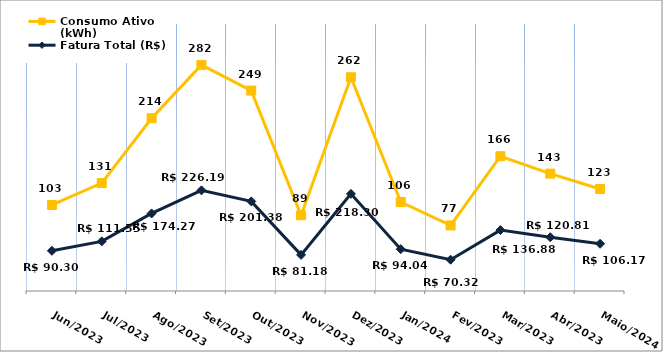
| Category | Fatura Total (R$) | Consumo Ativo (kWh) |
|---|---|---|
| Jun/2023 | 90.3 | 103 |
| Jul/2023 | 111.55 | 131 |
| Ago/2023 | 174.27 | 214 |
| Set/2023 | 226.19 | 282 |
| Out/2023 | 201.38 | 249 |
| Nov/2023 | 81.18 | 89 |
| Dez/2023 | 218.3 | 262 |
| Jan/2024 | 94.04 | 106 |
| Fev/2023 | 70.32 | 77 |
| Mar/2023 | 136.88 | 166 |
| Abr/2023 | 120.81 | 143 |
| Maio/2024 | 106.17 | 123 |